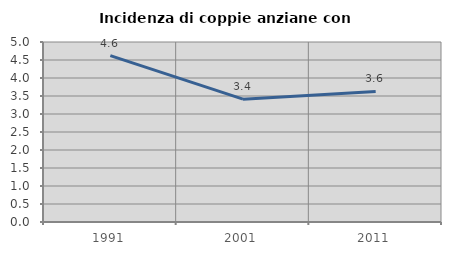
| Category | Incidenza di coppie anziane con figli |
|---|---|
| 1991.0 | 4.62 |
| 2001.0 | 3.412 |
| 2011.0 | 3.628 |